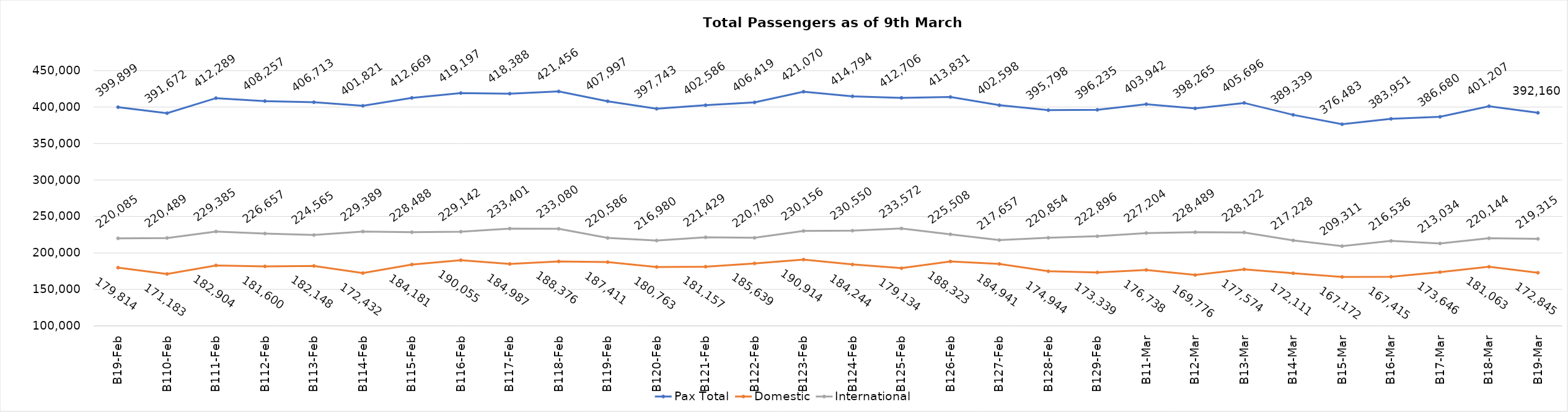
| Category | Pax Total | Domestic | International |
|---|---|---|---|
| 2024-02-09 | 399899 | 179814 | 220085 |
| 2024-02-10 | 391672 | 171183 | 220489 |
| 2024-02-11 | 412289 | 182904 | 229385 |
| 2024-02-12 | 408257 | 181600 | 226657 |
| 2024-02-13 | 406713 | 182148 | 224565 |
| 2024-02-14 | 401821 | 172432 | 229389 |
| 2024-02-15 | 412669 | 184181 | 228488 |
| 2024-02-16 | 419197 | 190055 | 229142 |
| 2024-02-17 | 418388 | 184987 | 233401 |
| 2024-02-18 | 421456 | 188376 | 233080 |
| 2024-02-19 | 407997 | 187411 | 220586 |
| 2024-02-20 | 397743 | 180763 | 216980 |
| 2024-02-21 | 402586 | 181157 | 221429 |
| 2024-02-22 | 406419 | 185639 | 220780 |
| 2024-02-23 | 421070 | 190914 | 230156 |
| 2024-02-24 | 414794 | 184244 | 230550 |
| 2024-02-25 | 412706 | 179134 | 233572 |
| 2024-02-26 | 413831 | 188323 | 225508 |
| 2024-02-27 | 402598 | 184941 | 217657 |
| 2024-02-28 | 395798 | 174944 | 220854 |
| 2024-02-29 | 396235 | 173339 | 222896 |
| 2024-03-01 | 403942 | 176738 | 227204 |
| 2024-03-02 | 398265 | 169776 | 228489 |
| 2024-03-03 | 405696 | 177574 | 228122 |
| 2024-03-04 | 389339 | 172111 | 217228 |
| 2024-03-05 | 376483 | 167172 | 209311 |
| 2024-03-06 | 383951 | 167415 | 216536 |
| 2024-03-07 | 386680 | 173646 | 213034 |
| 2024-03-08 | 401207 | 181063 | 220144 |
| 2024-03-09 | 392160 | 172845 | 219315 |